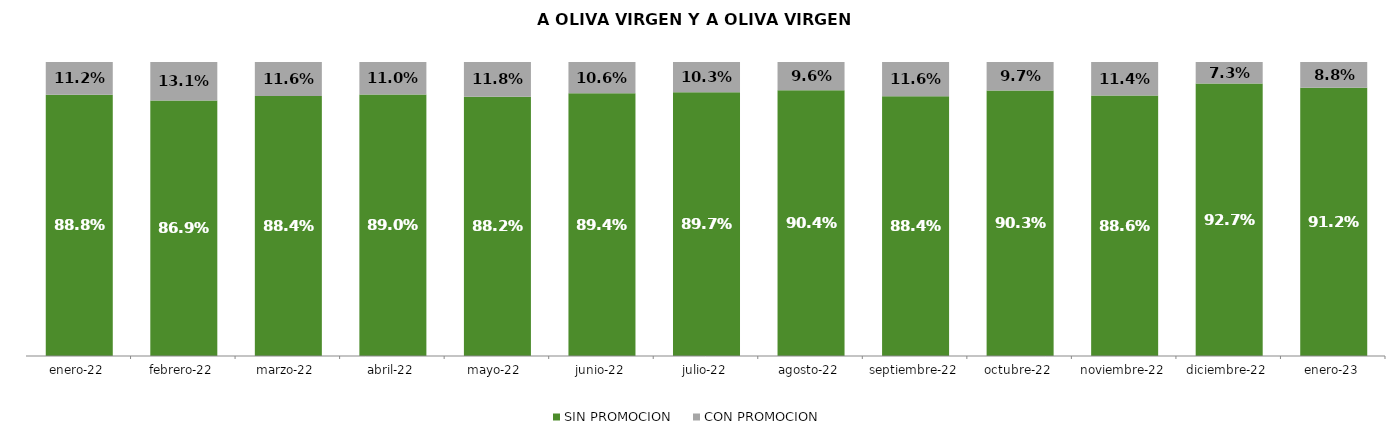
| Category | SIN PROMOCION   | CON PROMOCION   |
|---|---|---|
| 2022-01-01 | 0.888 | 0.112 |
| 2022-02-01 | 0.869 | 0.131 |
| 2022-03-01 | 0.884 | 0.116 |
| 2022-04-01 | 0.89 | 0.11 |
| 2022-05-01 | 0.882 | 0.118 |
| 2022-06-01 | 0.894 | 0.106 |
| 2022-07-01 | 0.897 | 0.103 |
| 2022-08-01 | 0.904 | 0.096 |
| 2022-09-01 | 0.884 | 0.116 |
| 2022-10-01 | 0.903 | 0.097 |
| 2022-11-01 | 0.886 | 0.114 |
| 2022-12-01 | 0.927 | 0.073 |
| 2023-01-01 | 0.912 | 0.088 |